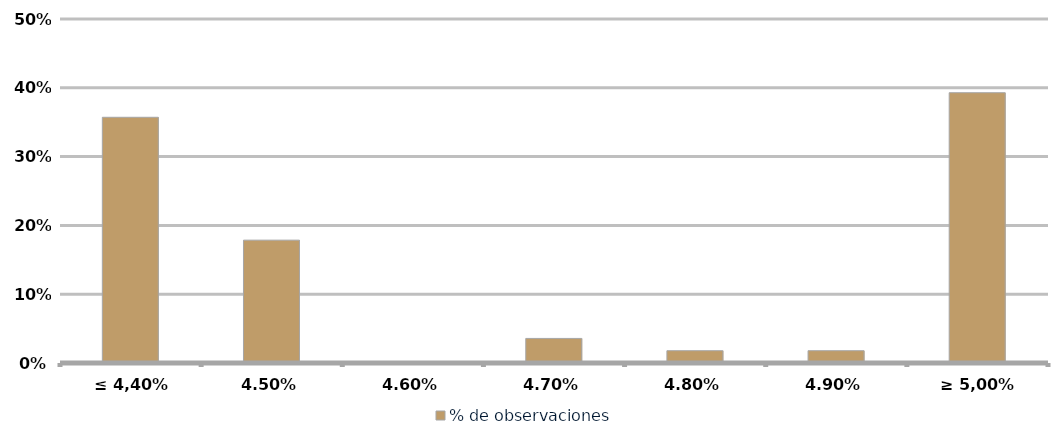
| Category | % de observaciones  |
|---|---|
| ≤ 4,40% | 0.357 |
| 4,50% | 0.179 |
| 4,60% | 0 |
| 4,70% | 0.036 |
| 4,80% | 0.018 |
| 4,90% | 0.018 |
| ≥ 5,00% | 0.393 |